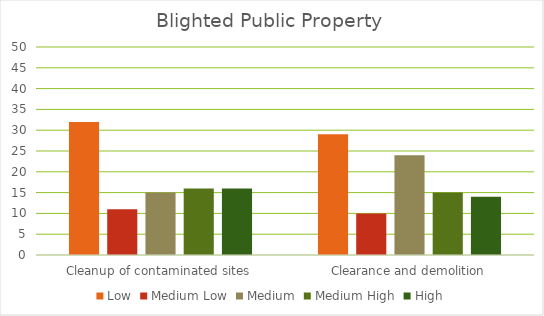
| Category | Low | Medium Low | Medium | Medium High | High |
|---|---|---|---|---|---|
| Cleanup of contaminated sites | 32 | 11 | 15 | 16 | 16 |
| Clearance and demolition | 29 | 10 | 24 | 15 | 14 |